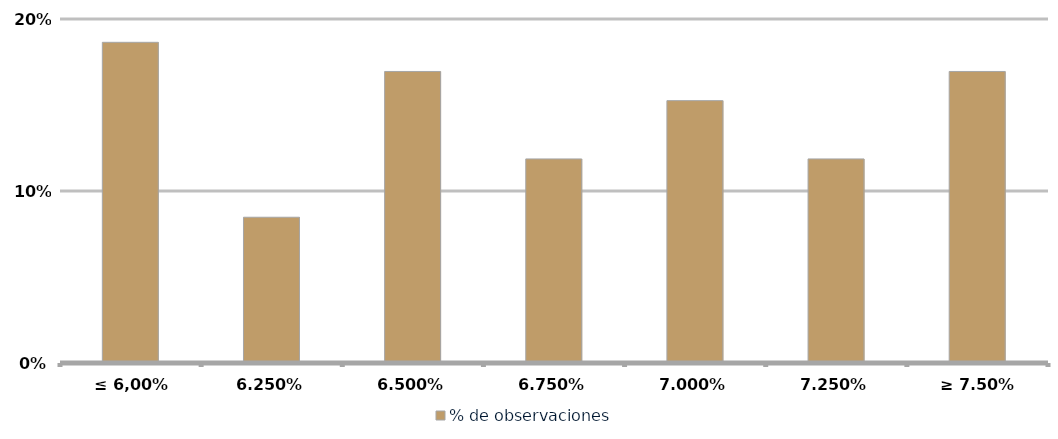
| Category | % de observaciones  |
|---|---|
| ≤ 6,00% | 0.186 |
| 6,25% | 0.085 |
| 6,50% | 0.169 |
| 6,75% | 0.119 |
| 7,00% | 0.153 |
| 7,25% | 0.119 |
| ≥ 7.50% | 0.169 |